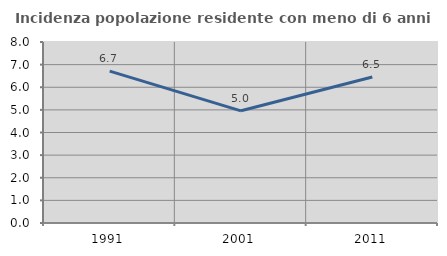
| Category | Incidenza popolazione residente con meno di 6 anni |
|---|---|
| 1991.0 | 6.713 |
| 2001.0 | 4.958 |
| 2011.0 | 6.45 |